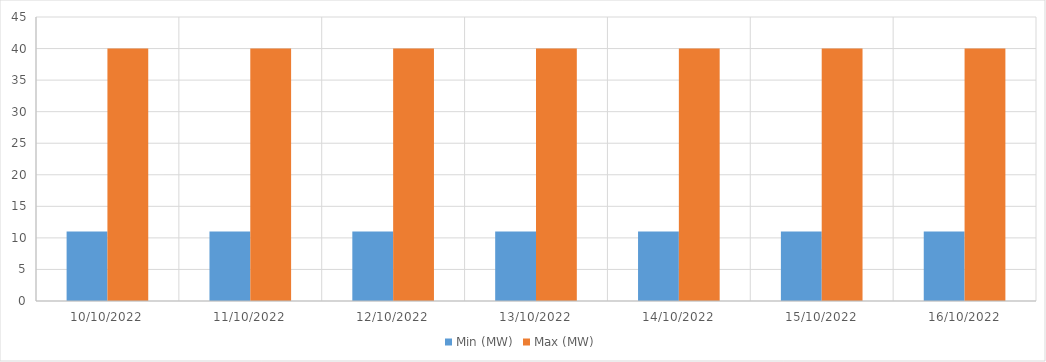
| Category | Min (MW) | Max (MW) |
|---|---|---|
| 10/10/2022 | 11 | 40 |
| 11/10/2022 | 11 | 40 |
| 12/10/2022 | 11 | 40 |
| 13/10/2022 | 11 | 40 |
| 14/10/2022 | 11 | 40 |
| 15/10/2022 | 11 | 40 |
| 16/10/2022 | 11 | 40 |